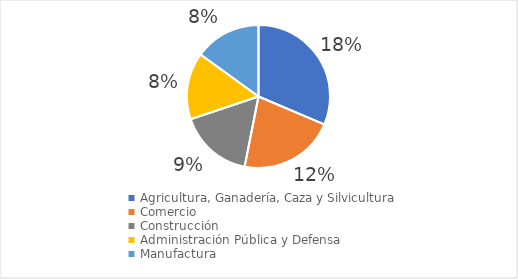
| Category | Series 0 |
|---|---|
| Agricultura, Ganadería, Caza y Silvicultura | 0.175 |
| Comercio | 0.121 |
| Construcción | 0.093 |
| Administración Pública y Defensa | 0.085 |
| Manufactura | 0.084 |